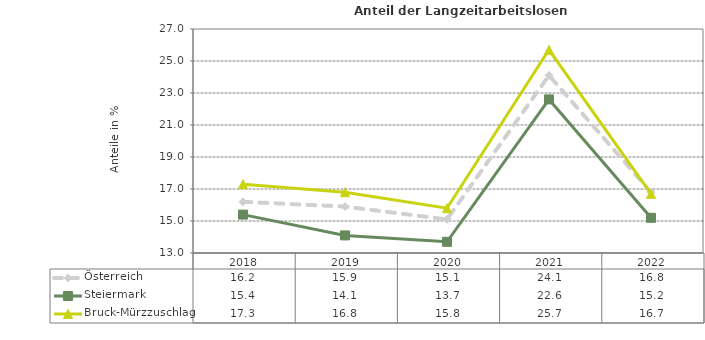
| Category | Österreich | Steiermark | Bruck-Mürzzuschlag |
|---|---|---|---|
| 2022.0 | 16.8 | 15.2 | 16.7 |
| 2021.0 | 24.1 | 22.6 | 25.7 |
| 2020.0 | 15.1 | 13.7 | 15.8 |
| 2019.0 | 15.9 | 14.1 | 16.8 |
| 2018.0 | 16.2 | 15.4 | 17.3 |